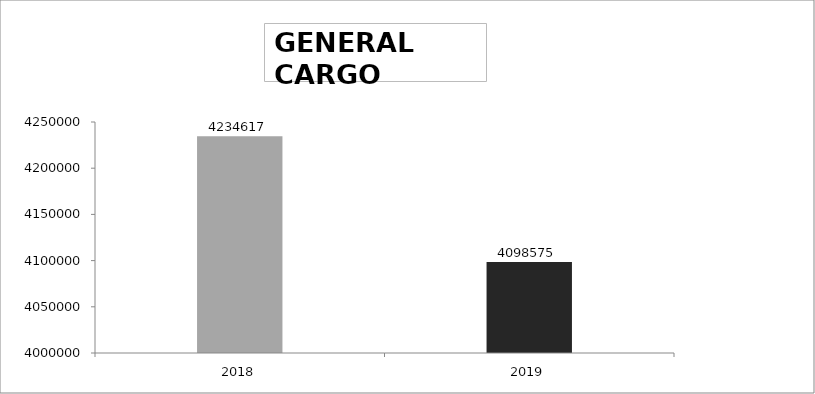
| Category | 2019 |
|---|---|
| 2018.0 | 4234617 |
| 2019.0 | 4098575 |